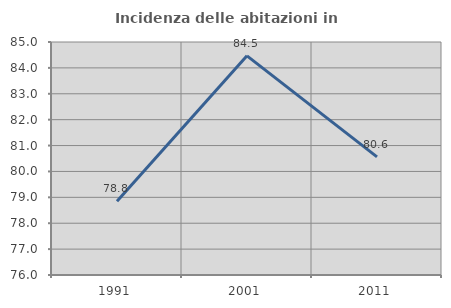
| Category | Incidenza delle abitazioni in proprietà  |
|---|---|
| 1991.0 | 78.85 |
| 2001.0 | 84.466 |
| 2011.0 | 80.561 |